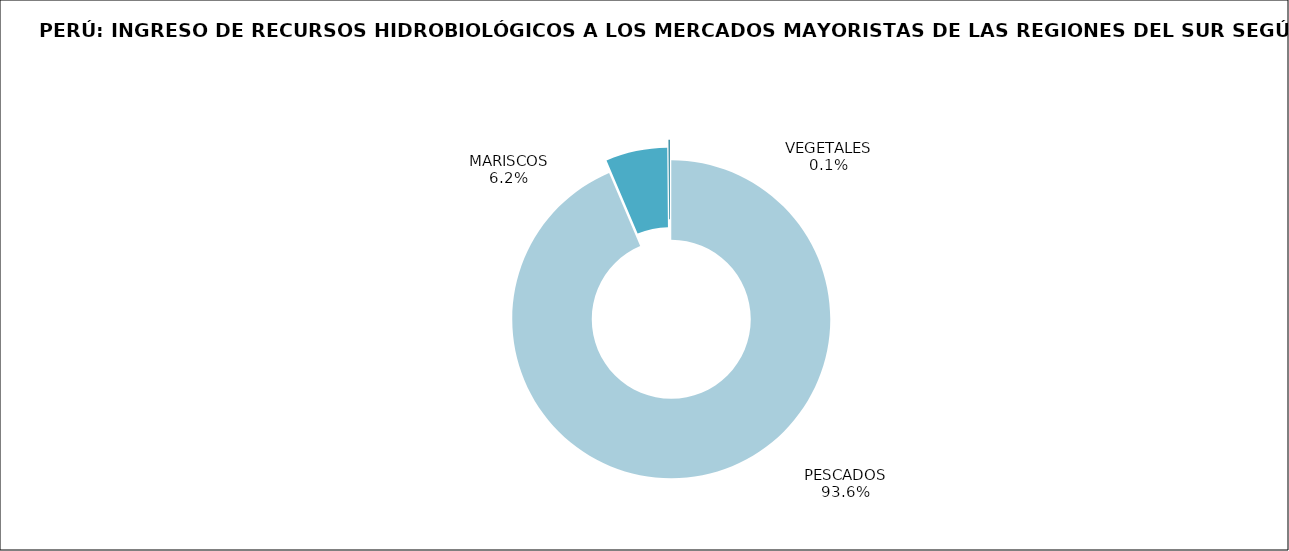
| Category | Series 0 |
|---|---|
| PESCADOS | 12378.257 |
| MARISCOS | 825.79 |
| VEGETALES | 19.649 |